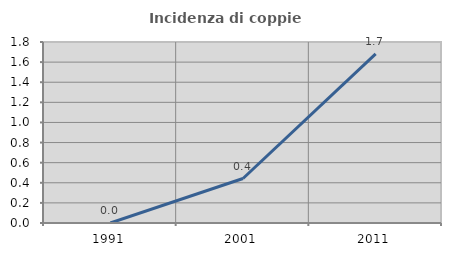
| Category | Incidenza di coppie miste |
|---|---|
| 1991.0 | 0 |
| 2001.0 | 0.442 |
| 2011.0 | 1.683 |